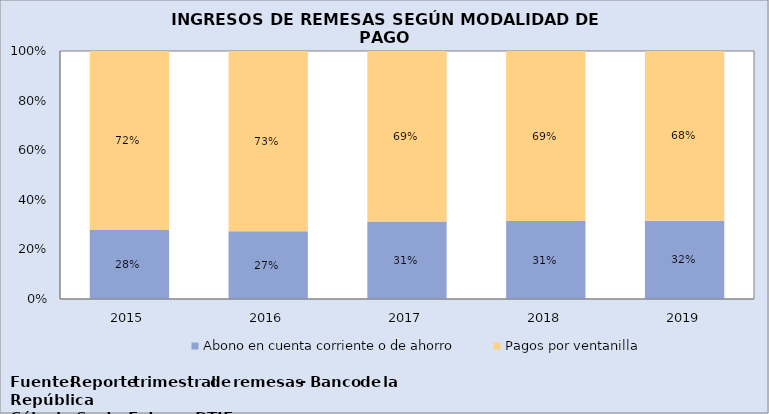
| Category | Abono en cuenta corriente o de ahorro | Pagos por ventanilla |
|---|---|---|
| 2015.0 | 0.279 | 0.721 |
| 2016.0 | 0.273 | 0.727 |
| 2017.0 | 0.313 | 0.687 |
| 2018.0 | 0.314 | 0.686 |
| 2019.0 | 0.315 | 0.684 |